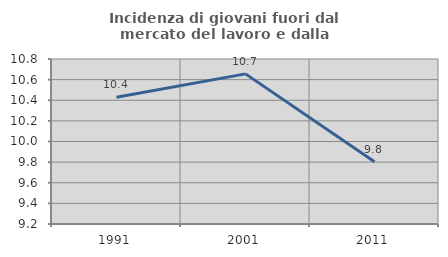
| Category | Incidenza di giovani fuori dal mercato del lavoro e dalla formazione  |
|---|---|
| 1991.0 | 10.429 |
| 2001.0 | 10.656 |
| 2011.0 | 9.804 |